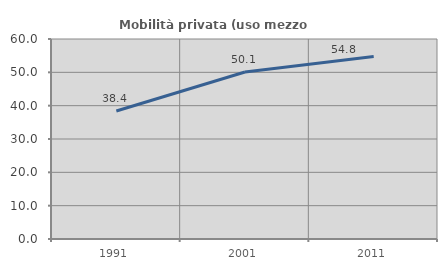
| Category | Mobilità privata (uso mezzo privato) |
|---|---|
| 1991.0 | 38.413 |
| 2001.0 | 50.107 |
| 2011.0 | 54.779 |